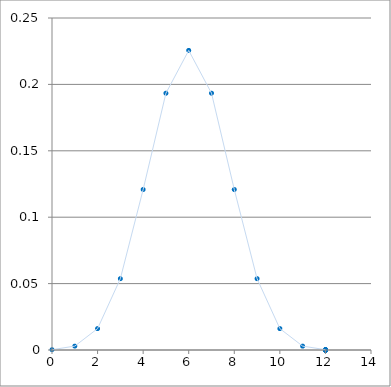
| Category | Series 0 |
|---|---|
| 0.0 | 0 |
| 1.0 | 0.003 |
| 2.0 | 0.016 |
| 3.0 | 0.054 |
| 4.0 | 0.121 |
| 5.0 | 0.193 |
| 6.0 | 0.226 |
| 7.0 | 0.193 |
| 8.0 | 0.121 |
| 9.0 | 0.054 |
| 10.0 | 0.016 |
| 11.0 | 0.003 |
| 12.0 | 0 |
| 12.0 | 0 |
| 12.0 | 0 |
| 12.0 | 0 |
| 12.0 | 0 |
| 12.0 | 0 |
| 12.0 | 0 |
| 12.0 | 0 |
| 12.0 | 0 |
| 12.0 | 0 |
| 12.0 | 0 |
| 12.0 | 0 |
| 12.0 | 0 |
| 12.0 | 0 |
| 12.0 | 0 |
| 12.0 | 0 |
| 12.0 | 0 |
| 12.0 | 0 |
| 12.0 | 0 |
| 12.0 | 0 |
| 12.0 | 0 |
| 12.0 | 0 |
| 12.0 | 0 |
| 12.0 | 0 |
| 12.0 | 0 |
| 12.0 | 0 |
| 12.0 | 0 |
| 12.0 | 0 |
| 12.0 | 0 |
| 12.0 | 0 |
| 12.0 | 0 |
| 12.0 | 0 |
| 12.0 | 0 |
| 12.0 | 0 |
| 12.0 | 0 |
| 12.0 | 0 |
| 12.0 | 0 |
| 12.0 | 0 |
| 12.0 | 0 |
| 12.0 | 0 |
| 12.0 | 0 |
| 12.0 | 0 |
| 12.0 | 0 |
| 12.0 | 0 |
| 12.0 | 0 |
| 12.0 | 0 |
| 12.0 | 0 |
| 12.0 | 0 |
| 12.0 | 0 |
| 12.0 | 0 |
| 12.0 | 0 |
| 12.0 | 0 |
| 12.0 | 0 |
| 12.0 | 0 |
| 12.0 | 0 |
| 12.0 | 0 |
| 12.0 | 0 |
| 12.0 | 0 |
| 12.0 | 0 |
| 12.0 | 0 |
| 12.0 | 0 |
| 12.0 | 0 |
| 12.0 | 0 |
| 12.0 | 0 |
| 12.0 | 0 |
| 12.0 | 0 |
| 12.0 | 0 |
| 12.0 | 0 |
| 12.0 | 0 |
| 12.0 | 0 |
| 12.0 | 0 |
| 12.0 | 0 |
| 12.0 | 0 |
| 12.0 | 0 |
| 12.0 | 0 |
| 12.0 | 0 |
| 12.0 | 0 |
| 12.0 | 0 |
| 12.0 | 0 |
| 12.0 | 0 |
| 12.0 | 0 |
| 12.0 | 0 |
| 12.0 | 0 |
| 12.0 | 0 |
| 12.0 | 0 |
| 12.0 | 0 |
| 12.0 | 0 |
| 12.0 | 0 |
| 12.0 | 0 |
| 12.0 | 0 |
| 12.0 | 0 |
| 12.0 | 0 |
| 12.0 | 0 |
| 12.0 | 0 |
| 12.0 | 0 |
| 12.0 | 0 |
| 12.0 | 0 |
| 12.0 | 0 |
| 12.0 | 0 |
| 12.0 | 0 |
| 12.0 | 0 |
| 12.0 | 0 |
| 12.0 | 0 |
| 12.0 | 0 |
| 12.0 | 0 |
| 12.0 | 0 |
| 12.0 | 0 |
| 12.0 | 0 |
| 12.0 | 0 |
| 12.0 | 0 |
| 12.0 | 0 |
| 12.0 | 0 |
| 12.0 | 0 |
| 12.0 | 0 |
| 12.0 | 0 |
| 12.0 | 0 |
| 12.0 | 0 |
| 12.0 | 0 |
| 12.0 | 0 |
| 12.0 | 0 |
| 12.0 | 0 |
| 12.0 | 0 |
| 12.0 | 0 |
| 12.0 | 0 |
| 12.0 | 0 |
| 12.0 | 0 |
| 12.0 | 0 |
| 12.0 | 0 |
| 12.0 | 0 |
| 12.0 | 0 |
| 12.0 | 0 |
| 12.0 | 0 |
| 12.0 | 0 |
| 12.0 | 0 |
| 12.0 | 0 |
| 12.0 | 0 |
| 12.0 | 0 |
| 12.0 | 0 |
| 12.0 | 0 |
| 12.0 | 0 |
| 12.0 | 0 |
| 12.0 | 0 |
| 12.0 | 0 |
| 12.0 | 0 |
| 12.0 | 0 |
| 12.0 | 0 |
| 12.0 | 0 |
| 12.0 | 0 |
| 12.0 | 0 |
| 12.0 | 0 |
| 12.0 | 0 |
| 12.0 | 0 |
| 12.0 | 0 |
| 12.0 | 0 |
| 12.0 | 0 |
| 12.0 | 0 |
| 12.0 | 0 |
| 12.0 | 0 |
| 12.0 | 0 |
| 12.0 | 0 |
| 12.0 | 0 |
| 12.0 | 0 |
| 12.0 | 0 |
| 12.0 | 0 |
| 12.0 | 0 |
| 12.0 | 0 |
| 12.0 | 0 |
| 12.0 | 0 |
| 12.0 | 0 |
| 12.0 | 0 |
| 12.0 | 0 |
| 12.0 | 0 |
| 12.0 | 0 |
| 12.0 | 0 |
| 12.0 | 0 |
| 12.0 | 0 |
| 12.0 | 0 |
| 12.0 | 0 |
| 12.0 | 0 |
| 12.0 | 0 |
| 12.0 | 0 |
| 12.0 | 0 |
| 12.0 | 0 |
| 12.0 | 0 |
| 12.0 | 0 |
| 12.0 | 0 |
| 12.0 | 0 |
| 12.0 | 0 |
| 12.0 | 0 |
| 12.0 | 0 |
| 12.0 | 0 |
| 12.0 | 0 |
| 12.0 | 0 |
| 12.0 | 0 |
| 12.0 | 0 |
| 12.0 | 0 |
| 12.0 | 0 |
| 12.0 | 0 |
| 12.0 | 0 |
| 12.0 | 0 |
| 12.0 | 0 |
| 12.0 | 0 |
| 12.0 | 0 |
| 12.0 | 0 |
| 12.0 | 0 |
| 12.0 | 0 |
| 12.0 | 0 |
| 12.0 | 0 |
| 12.0 | 0 |
| 12.0 | 0 |
| 12.0 | 0 |
| 12.0 | 0 |
| 12.0 | 0 |
| 12.0 | 0 |
| 12.0 | 0 |
| 12.0 | 0 |
| 12.0 | 0 |
| 12.0 | 0 |
| 12.0 | 0 |
| 12.0 | 0 |
| 12.0 | 0 |
| 12.0 | 0 |
| 12.0 | 0 |
| 12.0 | 0 |
| 12.0 | 0 |
| 12.0 | 0 |
| 12.0 | 0 |
| 12.0 | 0 |
| 12.0 | 0 |
| 12.0 | 0 |
| 12.0 | 0 |
| 12.0 | 0 |
| 12.0 | 0 |
| 12.0 | 0 |
| 12.0 | 0 |
| 12.0 | 0 |
| 12.0 | 0 |
| 12.0 | 0 |
| 12.0 | 0 |
| 12.0 | 0 |
| 12.0 | 0 |
| 12.0 | 0 |
| 12.0 | 0 |
| 12.0 | 0 |
| 12.0 | 0 |
| 12.0 | 0 |
| 12.0 | 0 |
| 12.0 | 0 |
| 12.0 | 0 |
| 12.0 | 0 |
| 12.0 | 0 |
| 12.0 | 0 |
| 12.0 | 0 |
| 12.0 | 0 |
| 12.0 | 0 |
| 12.0 | 0 |
| 12.0 | 0 |
| 12.0 | 0 |
| 12.0 | 0 |
| 12.0 | 0 |
| 12.0 | 0 |
| 12.0 | 0 |
| 12.0 | 0 |
| 12.0 | 0 |
| 12.0 | 0 |
| 12.0 | 0 |
| 12.0 | 0 |
| 12.0 | 0 |
| 12.0 | 0 |
| 12.0 | 0 |
| 12.0 | 0 |
| 12.0 | 0 |
| 12.0 | 0 |
| 12.0 | 0 |
| 12.0 | 0 |
| 12.0 | 0 |
| 12.0 | 0 |
| 12.0 | 0 |
| 12.0 | 0 |
| 12.0 | 0 |
| 12.0 | 0 |
| 12.0 | 0 |
| 12.0 | 0 |
| 12.0 | 0 |
| 12.0 | 0 |
| 12.0 | 0 |
| 12.0 | 0 |
| 12.0 | 0 |
| 12.0 | 0 |
| 12.0 | 0 |
| 12.0 | 0 |
| 12.0 | 0 |
| 12.0 | 0 |
| 12.0 | 0 |
| 12.0 | 0 |
| 12.0 | 0 |
| 12.0 | 0 |
| 12.0 | 0 |
| 12.0 | 0 |
| 12.0 | 0 |
| 12.0 | 0 |
| 12.0 | 0 |
| 12.0 | 0 |
| 12.0 | 0 |
| 12.0 | 0 |
| 12.0 | 0 |
| 12.0 | 0 |
| 12.0 | 0 |
| 12.0 | 0 |
| 12.0 | 0 |
| 12.0 | 0 |
| 12.0 | 0 |
| 12.0 | 0 |
| 12.0 | 0 |
| 12.0 | 0 |
| 12.0 | 0 |
| 12.0 | 0 |
| 12.0 | 0 |
| 12.0 | 0 |
| 12.0 | 0 |
| 12.0 | 0 |
| 12.0 | 0 |
| 12.0 | 0 |
| 12.0 | 0 |
| 12.0 | 0 |
| 12.0 | 0 |
| 12.0 | 0 |
| 12.0 | 0 |
| 12.0 | 0 |
| 12.0 | 0 |
| 12.0 | 0 |
| 12.0 | 0 |
| 12.0 | 0 |
| 12.0 | 0 |
| 12.0 | 0 |
| 12.0 | 0 |
| 12.0 | 0 |
| 12.0 | 0 |
| 12.0 | 0 |
| 12.0 | 0 |
| 12.0 | 0 |
| 12.0 | 0 |
| 12.0 | 0 |
| 12.0 | 0 |
| 12.0 | 0 |
| 12.0 | 0 |
| 12.0 | 0 |
| 12.0 | 0 |
| 12.0 | 0 |
| 12.0 | 0 |
| 12.0 | 0 |
| 12.0 | 0 |
| 12.0 | 0 |
| 12.0 | 0 |
| 12.0 | 0 |
| 12.0 | 0 |
| 12.0 | 0 |
| 12.0 | 0 |
| 12.0 | 0 |
| 12.0 | 0 |
| 12.0 | 0 |
| 12.0 | 0 |
| 12.0 | 0 |
| 12.0 | 0 |
| 12.0 | 0 |
| 12.0 | 0 |
| 12.0 | 0 |
| 12.0 | 0 |
| 12.0 | 0 |
| 12.0 | 0 |
| 12.0 | 0 |
| 12.0 | 0 |
| 12.0 | 0 |
| 12.0 | 0 |
| 12.0 | 0 |
| 12.0 | 0 |
| 12.0 | 0 |
| 12.0 | 0 |
| 12.0 | 0 |
| 12.0 | 0 |
| 12.0 | 0 |
| 12.0 | 0 |
| 12.0 | 0 |
| 12.0 | 0 |
| 12.0 | 0 |
| 12.0 | 0 |
| 12.0 | 0 |
| 12.0 | 0 |
| 12.0 | 0 |
| 12.0 | 0 |
| 12.0 | 0 |
| 12.0 | 0 |
| 12.0 | 0 |
| 12.0 | 0 |
| 12.0 | 0 |
| 12.0 | 0 |
| 12.0 | 0 |
| 12.0 | 0 |
| 12.0 | 0 |
| 12.0 | 0 |
| 12.0 | 0 |
| 12.0 | 0 |
| 12.0 | 0 |
| 12.0 | 0 |
| 12.0 | 0 |
| 12.0 | 0 |
| 12.0 | 0 |
| 12.0 | 0 |
| 12.0 | 0 |
| 12.0 | 0 |
| 12.0 | 0 |
| 12.0 | 0 |
| 12.0 | 0 |
| 12.0 | 0 |
| 12.0 | 0 |
| 12.0 | 0 |
| 12.0 | 0 |
| 12.0 | 0 |
| 12.0 | 0 |
| 12.0 | 0 |
| 12.0 | 0 |
| 12.0 | 0 |
| 12.0 | 0 |
| 12.0 | 0 |
| 12.0 | 0 |
| 12.0 | 0 |
| 12.0 | 0 |
| 12.0 | 0 |
| 12.0 | 0 |
| 12.0 | 0 |
| 12.0 | 0 |
| 12.0 | 0 |
| 12.0 | 0 |
| 12.0 | 0 |
| 12.0 | 0 |
| 12.0 | 0 |
| 12.0 | 0 |
| 12.0 | 0 |
| 12.0 | 0 |
| 12.0 | 0 |
| 12.0 | 0 |
| 12.0 | 0 |
| 12.0 | 0 |
| 12.0 | 0 |
| 12.0 | 0 |
| 12.0 | 0 |
| 12.0 | 0 |
| 12.0 | 0 |
| 12.0 | 0 |
| 12.0 | 0 |
| 12.0 | 0 |
| 12.0 | 0 |
| 12.0 | 0 |
| 12.0 | 0 |
| 12.0 | 0 |
| 12.0 | 0 |
| 12.0 | 0 |
| 12.0 | 0 |
| 12.0 | 0 |
| 12.0 | 0 |
| 12.0 | 0 |
| 12.0 | 0 |
| 12.0 | 0 |
| 12.0 | 0 |
| 12.0 | 0 |
| 12.0 | 0 |
| 12.0 | 0 |
| 12.0 | 0 |
| 12.0 | 0 |
| 12.0 | 0 |
| 12.0 | 0 |
| 12.0 | 0 |
| 12.0 | 0 |
| 12.0 | 0 |
| 12.0 | 0 |
| 12.0 | 0 |
| 12.0 | 0 |
| 12.0 | 0 |
| 12.0 | 0 |
| 12.0 | 0 |
| 12.0 | 0 |
| 12.0 | 0 |
| 12.0 | 0 |
| 12.0 | 0 |
| 12.0 | 0 |
| 12.0 | 0 |
| 12.0 | 0 |
| 12.0 | 0 |
| 12.0 | 0 |
| 12.0 | 0 |
| 12.0 | 0 |
| 12.0 | 0 |
| 12.0 | 0 |
| 12.0 | 0 |
| 12.0 | 0 |
| 12.0 | 0 |
| 12.0 | 0 |
| 12.0 | 0 |
| 12.0 | 0 |
| 12.0 | 0 |
| 12.0 | 0 |
| 12.0 | 0 |
| 12.0 | 0 |
| 12.0 | 0 |
| 12.0 | 0 |
| 12.0 | 0 |
| 12.0 | 0 |
| 12.0 | 0 |
| 12.0 | 0 |
| 12.0 | 0 |
| 12.0 | 0 |
| 12.0 | 0 |
| 12.0 | 0 |
| 12.0 | 0 |
| 12.0 | 0 |
| 12.0 | 0 |
| 12.0 | 0 |
| 12.0 | 0 |
| 12.0 | 0 |
| 12.0 | 0 |
| 12.0 | 0 |
| 12.0 | 0 |
| 12.0 | 0 |
| 12.0 | 0 |
| 12.0 | 0 |
| 12.0 | 0 |
| 12.0 | 0 |
| 12.0 | 0 |
| 12.0 | 0 |
| 12.0 | 0 |
| 12.0 | 0 |
| 12.0 | 0 |
| 12.0 | 0 |
| 12.0 | 0 |
| 12.0 | 0 |
| 12.0 | 0 |
| 12.0 | 0 |
| 12.0 | 0 |
| 12.0 | 0 |
| 12.0 | 0 |
| 12.0 | 0 |
| 12.0 | 0 |
| 12.0 | 0 |
| 12.0 | 0 |
| 12.0 | 0 |
| 12.0 | 0 |
| 12.0 | 0 |
| 12.0 | 0 |
| 12.0 | 0 |
| 12.0 | 0 |
| 12.0 | 0 |
| 12.0 | 0 |
| 12.0 | 0 |
| 12.0 | 0 |
| 12.0 | 0 |
| 12.0 | 0 |
| 12.0 | 0 |
| 12.0 | 0 |
| 12.0 | 0 |
| 12.0 | 0 |
| 12.0 | 0 |
| 12.0 | 0 |
| 12.0 | 0 |
| 12.0 | 0 |
| 12.0 | 0 |
| 12.0 | 0 |
| 12.0 | 0 |
| 12.0 | 0 |
| 12.0 | 0 |
| 12.0 | 0 |
| 12.0 | 0 |
| 12.0 | 0 |
| 12.0 | 0 |
| 12.0 | 0 |
| 12.0 | 0 |
| 12.0 | 0 |
| 12.0 | 0 |
| 12.0 | 0 |
| 12.0 | 0 |
| 12.0 | 0 |
| 12.0 | 0 |
| 12.0 | 0 |
| 12.0 | 0 |
| 12.0 | 0 |
| 12.0 | 0 |
| 12.0 | 0 |
| 12.0 | 0 |
| 12.0 | 0 |
| 12.0 | 0 |
| 12.0 | 0 |
| 12.0 | 0 |
| 12.0 | 0 |
| 12.0 | 0 |
| 12.0 | 0 |
| 12.0 | 0 |
| 12.0 | 0 |
| 12.0 | 0 |
| 12.0 | 0 |
| 12.0 | 0 |
| 12.0 | 0 |
| 12.0 | 0 |
| 12.0 | 0 |
| 12.0 | 0 |
| 12.0 | 0 |
| 12.0 | 0 |
| 12.0 | 0 |
| 12.0 | 0 |
| 12.0 | 0 |
| 12.0 | 0 |
| 12.0 | 0 |
| 12.0 | 0 |
| 12.0 | 0 |
| 12.0 | 0 |
| 12.0 | 0 |
| 12.0 | 0 |
| 12.0 | 0 |
| 12.0 | 0 |
| 12.0 | 0 |
| 12.0 | 0 |
| 12.0 | 0 |
| 12.0 | 0 |
| 12.0 | 0 |
| 12.0 | 0 |
| 12.0 | 0 |
| 12.0 | 0 |
| 12.0 | 0 |
| 12.0 | 0 |
| 12.0 | 0 |
| 12.0 | 0 |
| 12.0 | 0 |
| 12.0 | 0 |
| 12.0 | 0 |
| 12.0 | 0 |
| 12.0 | 0 |
| 12.0 | 0 |
| 12.0 | 0 |
| 12.0 | 0 |
| 12.0 | 0 |
| 12.0 | 0 |
| 12.0 | 0 |
| 12.0 | 0 |
| 12.0 | 0 |
| 12.0 | 0 |
| 12.0 | 0 |
| 12.0 | 0 |
| 12.0 | 0 |
| 12.0 | 0 |
| 12.0 | 0 |
| 12.0 | 0 |
| 12.0 | 0 |
| 12.0 | 0 |
| 12.0 | 0 |
| 12.0 | 0 |
| 12.0 | 0 |
| 12.0 | 0 |
| 12.0 | 0 |
| 12.0 | 0 |
| 12.0 | 0 |
| 12.0 | 0 |
| 12.0 | 0 |
| 12.0 | 0 |
| 12.0 | 0 |
| 12.0 | 0 |
| 12.0 | 0 |
| 12.0 | 0 |
| 12.0 | 0 |
| 12.0 | 0 |
| 12.0 | 0 |
| 12.0 | 0 |
| 12.0 | 0 |
| 12.0 | 0 |
| 12.0 | 0 |
| 12.0 | 0 |
| 12.0 | 0 |
| 12.0 | 0 |
| 12.0 | 0 |
| 12.0 | 0 |
| 12.0 | 0 |
| 12.0 | 0 |
| 12.0 | 0 |
| 12.0 | 0 |
| 12.0 | 0 |
| 12.0 | 0 |
| 12.0 | 0 |
| 12.0 | 0 |
| 12.0 | 0 |
| 12.0 | 0 |
| 12.0 | 0 |
| 12.0 | 0 |
| 12.0 | 0 |
| 12.0 | 0 |
| 12.0 | 0 |
| 12.0 | 0 |
| 12.0 | 0 |
| 12.0 | 0 |
| 12.0 | 0 |
| 12.0 | 0 |
| 12.0 | 0 |
| 12.0 | 0 |
| 12.0 | 0 |
| 12.0 | 0 |
| 12.0 | 0 |
| 12.0 | 0 |
| 12.0 | 0 |
| 12.0 | 0 |
| 12.0 | 0 |
| 12.0 | 0 |
| 12.0 | 0 |
| 12.0 | 0 |
| 12.0 | 0 |
| 12.0 | 0 |
| 12.0 | 0 |
| 12.0 | 0 |
| 12.0 | 0 |
| 12.0 | 0 |
| 12.0 | 0 |
| 12.0 | 0 |
| 12.0 | 0 |
| 12.0 | 0 |
| 12.0 | 0 |
| 12.0 | 0 |
| 12.0 | 0 |
| 12.0 | 0 |
| 12.0 | 0 |
| 12.0 | 0 |
| 12.0 | 0 |
| 12.0 | 0 |
| 12.0 | 0 |
| 12.0 | 0 |
| 12.0 | 0 |
| 12.0 | 0 |
| 12.0 | 0 |
| 12.0 | 0 |
| 12.0 | 0 |
| 12.0 | 0 |
| 12.0 | 0 |
| 12.0 | 0 |
| 12.0 | 0 |
| 12.0 | 0 |
| 12.0 | 0 |
| 12.0 | 0 |
| 12.0 | 0 |
| 12.0 | 0 |
| 12.0 | 0 |
| 12.0 | 0 |
| 12.0 | 0 |
| 12.0 | 0 |
| 12.0 | 0 |
| 12.0 | 0 |
| 12.0 | 0 |
| 12.0 | 0 |
| 12.0 | 0 |
| 12.0 | 0 |
| 12.0 | 0 |
| 12.0 | 0 |
| 12.0 | 0 |
| 12.0 | 0 |
| 12.0 | 0 |
| 12.0 | 0 |
| 12.0 | 0 |
| 12.0 | 0 |
| 12.0 | 0 |
| 12.0 | 0 |
| 12.0 | 0 |
| 12.0 | 0 |
| 12.0 | 0 |
| 12.0 | 0 |
| 12.0 | 0 |
| 12.0 | 0 |
| 12.0 | 0 |
| 12.0 | 0 |
| 12.0 | 0 |
| 12.0 | 0 |
| 12.0 | 0 |
| 12.0 | 0 |
| 12.0 | 0 |
| 12.0 | 0 |
| 12.0 | 0 |
| 12.0 | 0 |
| 12.0 | 0 |
| 12.0 | 0 |
| 12.0 | 0 |
| 12.0 | 0 |
| 12.0 | 0 |
| 12.0 | 0 |
| 12.0 | 0 |
| 12.0 | 0 |
| 12.0 | 0 |
| 12.0 | 0 |
| 12.0 | 0 |
| 12.0 | 0 |
| 12.0 | 0 |
| 12.0 | 0 |
| 12.0 | 0 |
| 12.0 | 0 |
| 12.0 | 0 |
| 12.0 | 0 |
| 12.0 | 0 |
| 12.0 | 0 |
| 12.0 | 0 |
| 12.0 | 0 |
| 12.0 | 0 |
| 12.0 | 0 |
| 12.0 | 0 |
| 12.0 | 0 |
| 12.0 | 0 |
| 12.0 | 0 |
| 12.0 | 0 |
| 12.0 | 0 |
| 12.0 | 0 |
| 12.0 | 0 |
| 12.0 | 0 |
| 12.0 | 0 |
| 12.0 | 0 |
| 12.0 | 0 |
| 12.0 | 0 |
| 12.0 | 0 |
| 12.0 | 0 |
| 12.0 | 0 |
| 12.0 | 0 |
| 12.0 | 0 |
| 12.0 | 0 |
| 12.0 | 0 |
| 12.0 | 0 |
| 12.0 | 0 |
| 12.0 | 0 |
| 12.0 | 0 |
| 12.0 | 0 |
| 12.0 | 0 |
| 12.0 | 0 |
| 12.0 | 0 |
| 12.0 | 0 |
| 12.0 | 0 |
| 12.0 | 0 |
| 12.0 | 0 |
| 12.0 | 0 |
| 12.0 | 0 |
| 12.0 | 0 |
| 12.0 | 0 |
| 12.0 | 0 |
| 12.0 | 0 |
| 12.0 | 0 |
| 12.0 | 0 |
| 12.0 | 0 |
| 12.0 | 0 |
| 12.0 | 0 |
| 12.0 | 0 |
| 12.0 | 0 |
| 12.0 | 0 |
| 12.0 | 0 |
| 12.0 | 0 |
| 12.0 | 0 |
| 12.0 | 0 |
| 12.0 | 0 |
| 12.0 | 0 |
| 12.0 | 0 |
| 12.0 | 0 |
| 12.0 | 0 |
| 12.0 | 0 |
| 12.0 | 0 |
| 12.0 | 0 |
| 12.0 | 0 |
| 12.0 | 0 |
| 12.0 | 0 |
| 12.0 | 0 |
| 12.0 | 0 |
| 12.0 | 0 |
| 12.0 | 0 |
| 12.0 | 0 |
| 12.0 | 0 |
| 12.0 | 0 |
| 12.0 | 0 |
| 12.0 | 0 |
| 12.0 | 0 |
| 12.0 | 0 |
| 12.0 | 0 |
| 12.0 | 0 |
| 12.0 | 0 |
| 12.0 | 0 |
| 12.0 | 0 |
| 12.0 | 0 |
| 12.0 | 0 |
| 12.0 | 0 |
| 12.0 | 0 |
| 12.0 | 0 |
| 12.0 | 0 |
| 12.0 | 0 |
| 12.0 | 0 |
| 12.0 | 0 |
| 12.0 | 0 |
| 12.0 | 0 |
| 12.0 | 0 |
| 12.0 | 0 |
| 12.0 | 0 |
| 12.0 | 0 |
| 12.0 | 0 |
| 12.0 | 0 |
| 12.0 | 0 |
| 12.0 | 0 |
| 12.0 | 0 |
| 12.0 | 0 |
| 12.0 | 0 |
| 12.0 | 0 |
| 12.0 | 0 |
| 12.0 | 0 |
| 12.0 | 0 |
| 12.0 | 0 |
| 12.0 | 0 |
| 12.0 | 0 |
| 12.0 | 0 |
| 12.0 | 0 |
| 12.0 | 0 |
| 12.0 | 0 |
| 12.0 | 0 |
| 12.0 | 0 |
| 12.0 | 0 |
| 12.0 | 0 |
| 12.0 | 0 |
| 12.0 | 0 |
| 12.0 | 0 |
| 12.0 | 0 |
| 12.0 | 0 |
| 12.0 | 0 |
| 12.0 | 0 |
| 12.0 | 0 |
| 12.0 | 0 |
| 12.0 | 0 |
| 12.0 | 0 |
| 12.0 | 0 |
| 12.0 | 0 |
| 12.0 | 0 |
| 12.0 | 0 |
| 12.0 | 0 |
| 12.0 | 0 |
| 12.0 | 0 |
| 12.0 | 0 |
| 12.0 | 0 |
| 12.0 | 0 |
| 12.0 | 0 |
| 12.0 | 0 |
| 12.0 | 0 |
| 12.0 | 0 |
| 12.0 | 0 |
| 12.0 | 0 |
| 12.0 | 0 |
| 12.0 | 0 |
| 12.0 | 0 |
| 12.0 | 0 |
| 12.0 | 0 |
| 12.0 | 0 |
| 12.0 | 0 |
| 12.0 | 0 |
| 12.0 | 0 |
| 12.0 | 0 |
| 12.0 | 0 |
| 12.0 | 0 |
| 12.0 | 0 |
| 12.0 | 0 |
| 12.0 | 0 |
| 12.0 | 0 |
| 12.0 | 0 |
| 12.0 | 0 |
| 12.0 | 0 |
| 12.0 | 0 |
| 12.0 | 0 |
| 12.0 | 0 |
| 12.0 | 0 |
| 12.0 | 0 |
| 12.0 | 0 |
| 12.0 | 0 |
| 12.0 | 0 |
| 12.0 | 0 |
| 12.0 | 0 |
| 12.0 | 0 |
| 12.0 | 0 |
| 12.0 | 0 |
| 12.0 | 0 |
| 12.0 | 0 |
| 12.0 | 0 |
| 12.0 | 0 |
| 12.0 | 0 |
| 12.0 | 0 |
| 12.0 | 0 |
| 12.0 | 0 |
| 12.0 | 0 |
| 12.0 | 0 |
| 12.0 | 0 |
| 12.0 | 0 |
| 12.0 | 0 |